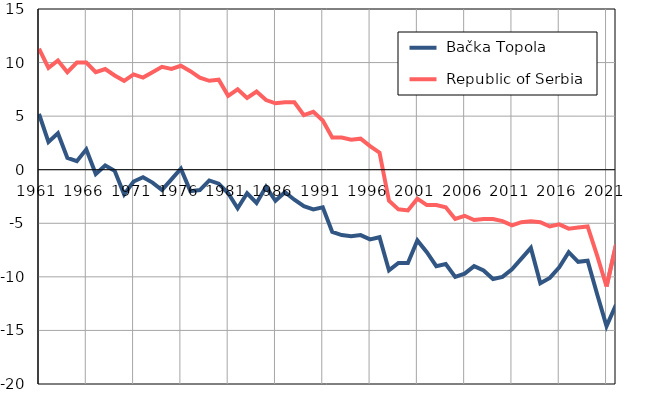
| Category |  Bačka Topola |  Republic of Serbia |
|---|---|---|
| 1961.0 | 5.2 | 11.3 |
| 1962.0 | 2.6 | 9.5 |
| 1963.0 | 3.4 | 10.2 |
| 1964.0 | 1.1 | 9.1 |
| 1965.0 | 0.8 | 10 |
| 1966.0 | 1.9 | 10 |
| 1967.0 | -0.4 | 9.1 |
| 1968.0 | 0.4 | 9.4 |
| 1969.0 | -0.1 | 8.8 |
| 1970.0 | -2.3 | 8.3 |
| 1971.0 | -1.1 | 8.9 |
| 1972.0 | -0.7 | 8.6 |
| 1973.0 | -1.2 | 9.1 |
| 1974.0 | -1.9 | 9.6 |
| 1975.0 | -0.9 | 9.4 |
| 1976.0 | 0.1 | 9.7 |
| 1977.0 | -2 | 9.2 |
| 1978.0 | -1.9 | 8.6 |
| 1979.0 | -1 | 8.3 |
| 1980.0 | -1.3 | 8.4 |
| 1981.0 | -2.2 | 6.9 |
| 1982.0 | -3.6 | 7.5 |
| 1983.0 | -2.2 | 6.7 |
| 1984.0 | -3.1 | 7.3 |
| 1985.0 | -1.6 | 6.5 |
| 1986.0 | -2.9 | 6.2 |
| 1987.0 | -2.1 | 6.3 |
| 1988.0 | -2.8 | 6.3 |
| 1989.0 | -3.4 | 5.1 |
| 1990.0 | -3.7 | 5.4 |
| 1991.0 | -3.5 | 4.6 |
| 1992.0 | -5.8 | 3 |
| 1993.0 | -6.1 | 3 |
| 1994.0 | -6.2 | 2.8 |
| 1995.0 | -6.1 | 2.9 |
| 1996.0 | -6.5 | 2.2 |
| 1997.0 | -6.3 | 1.6 |
| 1998.0 | -9.4 | -2.9 |
| 1999.0 | -8.7 | -3.7 |
| 2000.0 | -8.7 | -3.8 |
| 2001.0 | -6.6 | -2.7 |
| 2002.0 | -7.7 | -3.3 |
| 2003.0 | -9 | -3.3 |
| 2004.0 | -8.8 | -3.5 |
| 2005.0 | -10 | -4.6 |
| 2006.0 | -9.7 | -4.3 |
| 2007.0 | -9 | -4.7 |
| 2008.0 | -9.4 | -4.6 |
| 2009.0 | -10.2 | -4.6 |
| 2010.0 | -10 | -4.8 |
| 2011.0 | -9.3 | -5.2 |
| 2012.0 | -8.3 | -4.9 |
| 2013.0 | -7.3 | -4.8 |
| 2014.0 | -10.6 | -4.9 |
| 2015.0 | -10.1 | -5.3 |
| 2016.0 | -9.1 | -5.1 |
| 2017.0 | -7.7 | -5.5 |
| 2018.0 | -8.6 | -5.4 |
| 2019.0 | -8.5 | -5.3 |
| 2020.0 | -11.6 | -8 |
| 2021.0 | -14.6 | -10.9 |
| 2022.0 | -12.6 | -7 |